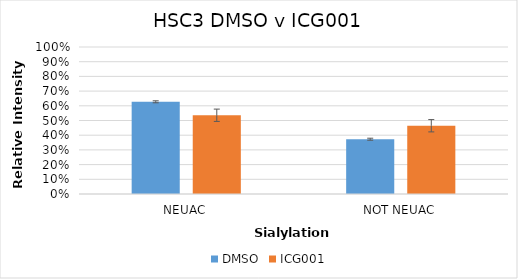
| Category | DMSO | ICG001 |
|---|---|---|
| NEUAC | 0.627 | 0.536 |
| NOT NEUAC | 0.373 | 0.464 |